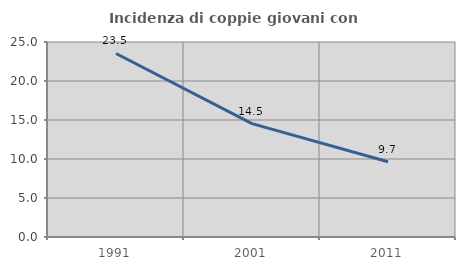
| Category | Incidenza di coppie giovani con figli |
|---|---|
| 1991.0 | 23.528 |
| 2001.0 | 14.537 |
| 2011.0 | 9.655 |